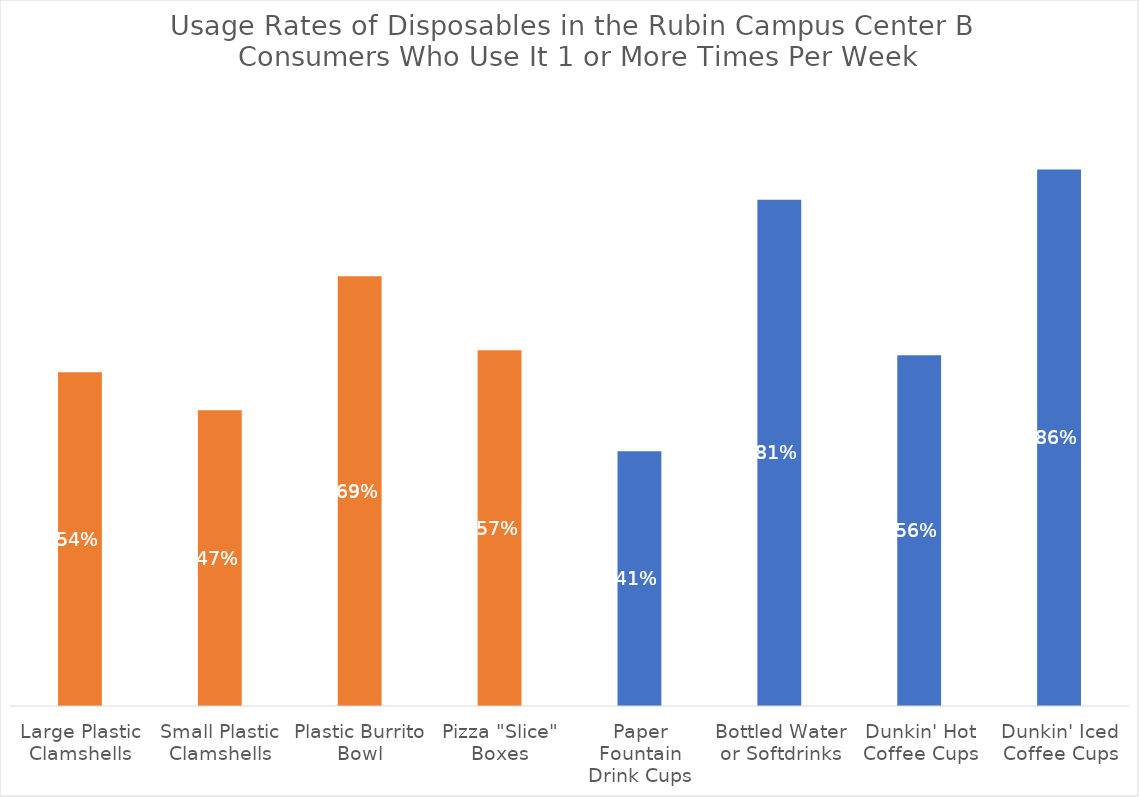
| Category | Series 0 |
|---|---|
| Large Plastic Clamshells | 0.535 |
| Small Plastic Clamshells | 0.474 |
| Plastic Burrito Bowl | 0.689 |
| Pizza "Slice" Boxes | 0.57 |
| Paper Fountain Drink Cups | 0.408 |
| Bottled Water or Softdrinks | 0.811 |
| Dunkin' Hot Coffee Cups | 0.562 |
| Dunkin' Iced Coffee Cups | 0.86 |